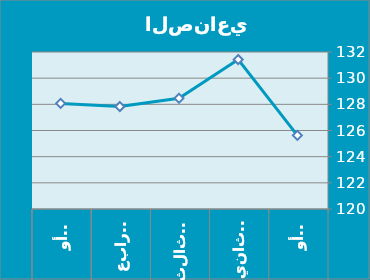
| Category | Series 0 |
|---|---|
| 0 | 125.63 |
| 1 | 131.42 |
| 2 | 128.46 |
| 3 | 127.83 |
| 4 | 128.07 |